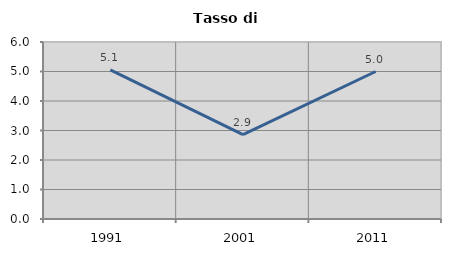
| Category | Tasso di disoccupazione   |
|---|---|
| 1991.0 | 5.058 |
| 2001.0 | 2.862 |
| 2011.0 | 5 |